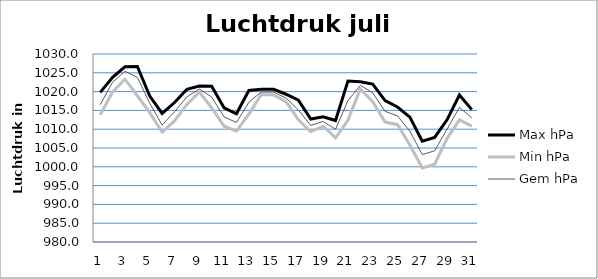
| Category | Max hPa | Min hPa | Gem hPa |
|---|---|---|---|
| 0 | 1019.8 | 1013.8 | 1016.5 |
| 1 | 1023.8 | 1019.9 | 1022.5 |
| 2 | 1026.6 | 1023.3 | 1025.4 |
| 3 | 1026.7 | 1018.9 | 1023.8 |
| 4 | 1018.8 | 1014.4 | 1016.9 |
| 5 | 1014.2 | 1009.2 | 1011.1 |
| 6 | 1017.1 | 1012.2 | 1014.65 |
| 7 | 1020.6 | 1016.6 | 1018.6 |
| 8 | 1021.5 | 1019.9 | 1020.7 |
| 9 | 1021.4 | 1015.7 | 1018.55 |
| 10 | 1015.7 | 1010.8 | 1013.25 |
| 11 | 1014.1 | 1009.5 | 1011.8 |
| 12 | 1020.3 | 1014 | 1017.15 |
| 13 | 1020.6 | 1019.2 | 1019.9 |
| 14 | 1020.6 | 1019.1 | 1019.85 |
| 15 | 1019.3 | 1017.3 | 1018.3 |
| 16 | 1017.7 | 1012.5 | 1015.1 |
| 17 | 1012.7 | 1009.3 | 1011 |
| 18 | 1013.3 | 1010.8 | 1012.05 |
| 19 | 1012.3 | 1007.7 | 1010 |
| 20 | 1022.8 | 1012.4 | 1017.6 |
| 21 | 1022.6 | 1020.7 | 1021.65 |
| 22 | 1022 | 1017.3 | 1019.65 |
| 23 | 1017.6 | 1011.9 | 1014.75 |
| 24 | 1015.9 | 1011.2 | 1013.55 |
| 25 | 1013.2 | 1005.8 | 1009.5 |
| 26 | 1006.8 | 999.7 | 1003.25 |
| 27 | 1007.8 | 1000.7 | 1004.25 |
| 28 | 1012.5 | 1007.5 | 1010 |
| 29 | 1019.1 | 1012.5 | 1015.8 |
| 30 | 1015.2 | 1010.8 | 1013 |